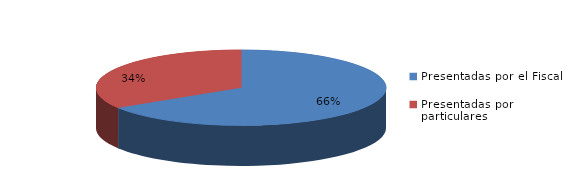
| Category | Series 0 |
|---|---|
| Presentadas por el Fiscal | 567 |
| Presentadas por particulares | 292 |